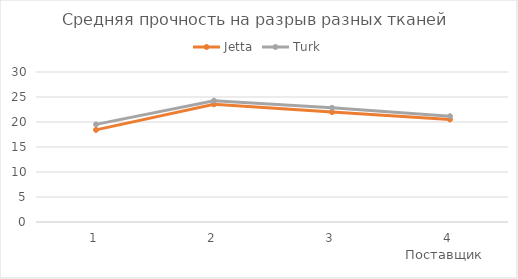
| Category | Jetta | Turk |
|---|---|---|
| 1.0 | 18.42 | 19.52 |
| 2.0 | 23.54 | 24.26 |
| 3.0 | 21.98 | 22.84 |
| 4.0 | 20.5 | 21.16 |